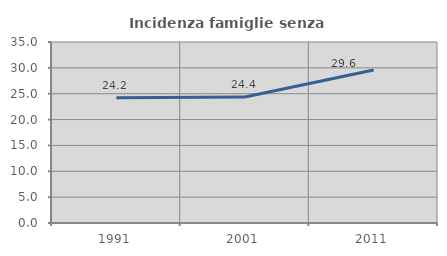
| Category | Incidenza famiglie senza nuclei |
|---|---|
| 1991.0 | 24.219 |
| 2001.0 | 24.36 |
| 2011.0 | 29.583 |